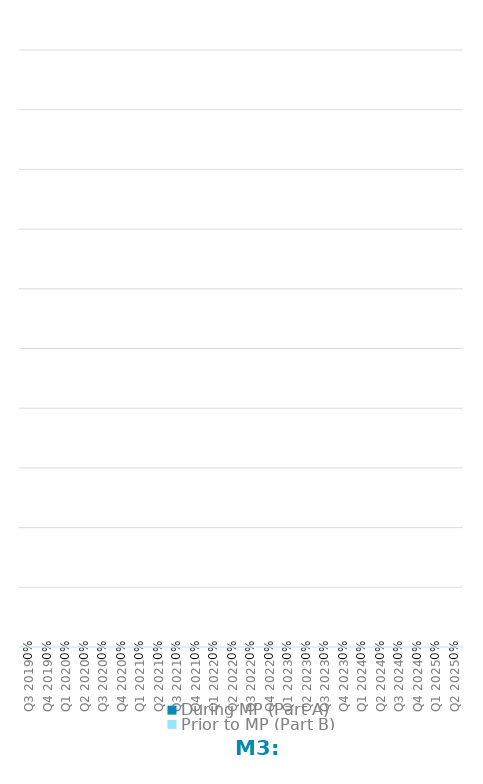
| Category | During MP (Part A) | Prior to MP (Part B) |
|---|---|---|
| Q3 2019 | 0 | 0 |
| Q4 2019 | 0 | 0 |
| Q1 2020 | 0 | 0 |
| Q2 2020 | 0 | 0 |
| Q3 2020 | 0 | 0 |
| Q4 2020 | 0 | 0 |
| Q1 2021 | 0 | 0 |
| Q2 2021 | 0 | 0 |
| Q3 2021 | 0 | 0 |
| Q4 2021 | 0 | 0 |
| Q1 2022 | 0 | 0 |
| Q2 2022 | 0 | 0 |
| Q3 2022 | 0 | 0 |
| Q4 2022 | 0 | 0 |
| Q1 2023 | 0 | 0 |
| Q2 2023 | 0 | 0 |
| Q3 2023 | 0 | 0 |
| Q4 2023 | 0 | 0 |
| Q1 2024 | 0 | 0 |
| Q2 2024 | 0 | 0 |
| Q3 2024 | 0 | 0 |
| Q4 2024 | 0 | 0 |
| Q1 2025 | 0 | 0 |
| Q2 2025 | 0 | 0 |